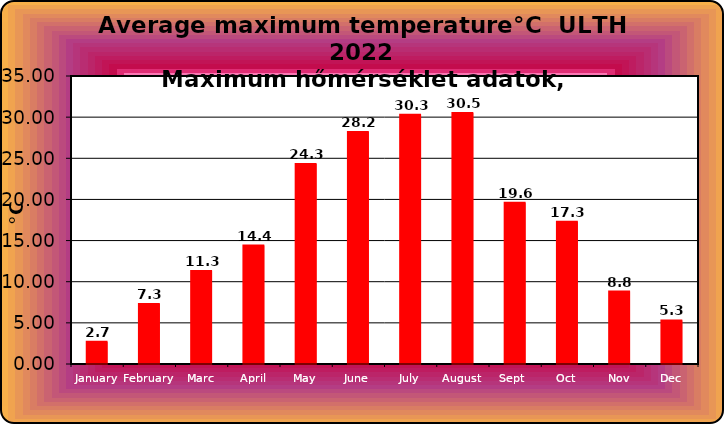
| Category | Series 0 |
|---|---|
| January | 2.7 |
| February | 7.3 |
| Marc | 11.3 |
| April | 14.4 |
| May | 24.3 |
| June | 28.2 |
| July | 30.3 |
| August | 30.5 |
| Sept  | 19.6 |
| Oct | 17.3 |
| Nov | 8.8 |
| Dec | 5.3 |